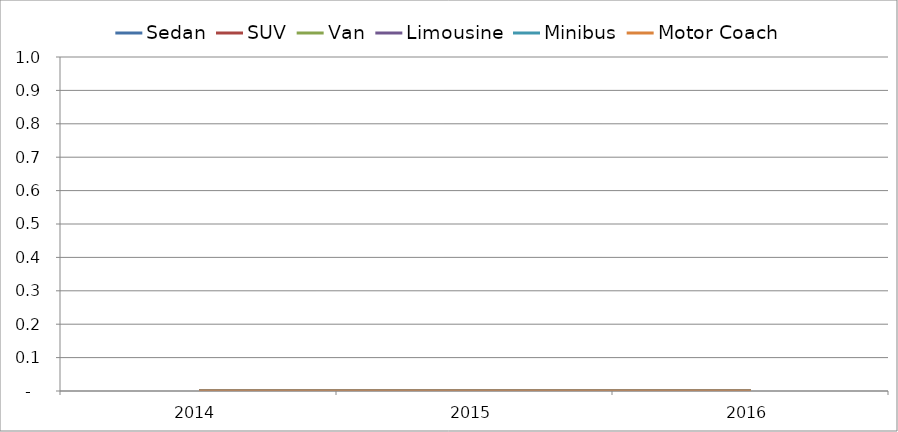
| Category | Sedan | SUV | Van | Limousine | Minibus | Motor Coach |
|---|---|---|---|---|---|---|
| 2014 | 0 | 0 | 0 | 0 | 0 | 0 |
| 2015 | 0 | 0 | 0 | 0 | 0 | 0 |
| 2016 | 0 | 0 | 0 | 0 | 0 | 0 |